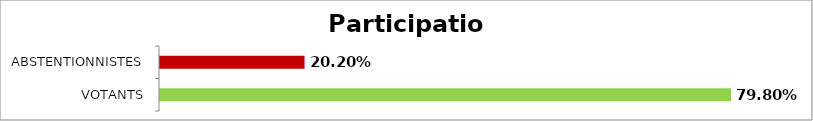
| Category | Participation |
|---|---|
| VOTANTS | 0.798 |
| ABSTENTIONNISTES | 0.202 |